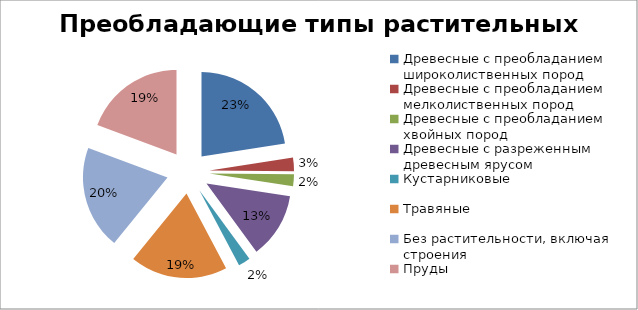
| Category | Series 0 |
|---|---|
| Древесные с преобладанием широколиственных пород | 22.5 |
| Древесные с преобладанием мелколиственных пород | 2.6 |
| Древесные с преобладанием хвойных пород | 2.3 |
| Древесные с разреженным древесным ярусом | 12.5 |
| Кустарниковые | 2.3 |
| Травяные | 18.6 |
| Без растительности, включая строения | 19.8 |
| Пруды | 19.3 |